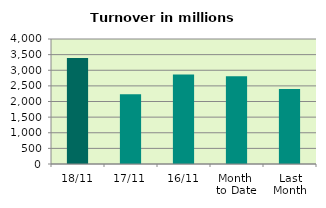
| Category | Series 0 |
|---|---|
| 18/11 | 3393.156 |
| 17/11 | 2232.924 |
| 16/11 | 2864.719 |
| Month 
to Date | 2811.744 |
| Last
Month | 2399.244 |